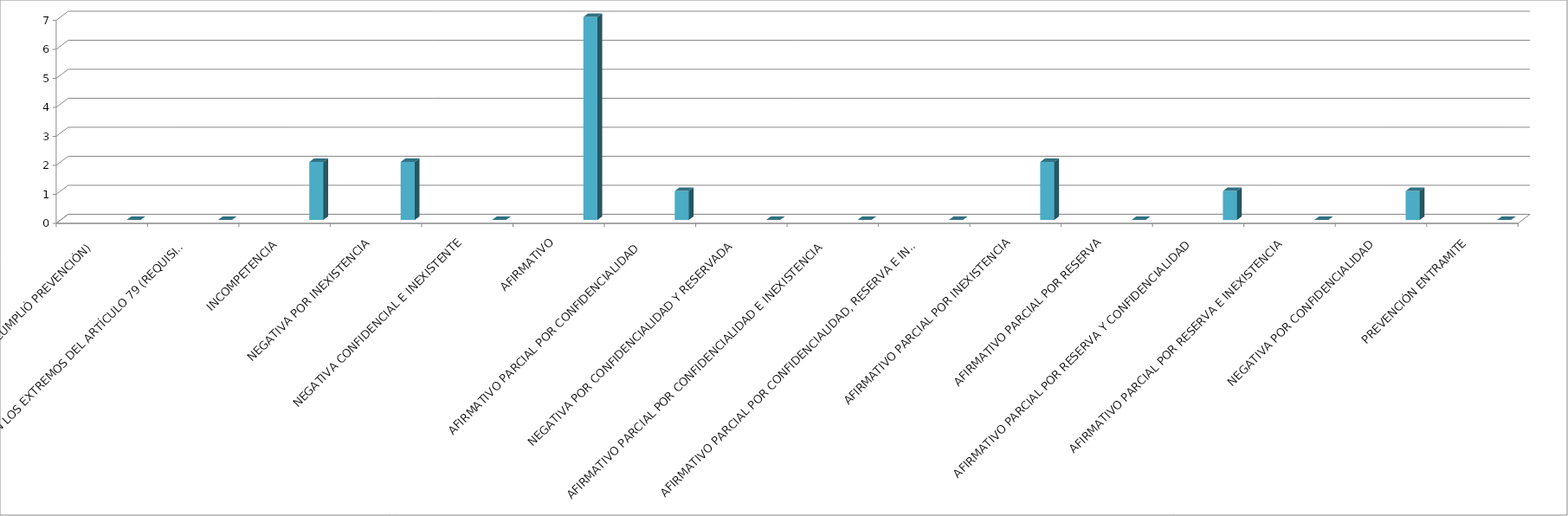
| Category | Series 0 | Series 1 | Series 2 | Series 3 | Series 4 |
|---|---|---|---|---|---|
| SE TIENE POR NO PRESENTADA ( NO CUMPLIÓ PREVENCIÓN) |  |  |  |  | 0 |
| NO CUMPLIO CON LOS EXTREMOS DEL ARTÍCULO 79 (REQUISITOS) |  |  |  |  | 0 |
| INCOMPETENCIA  |  |  |  |  | 2 |
| NEGATIVA POR INEXISTENCIA |  |  |  |  | 2 |
| NEGATIVA CONFIDENCIAL E INEXISTENTE |  |  |  |  | 0 |
| AFIRMATIVO |  |  |  |  | 7 |
| AFIRMATIVO PARCIAL POR CONFIDENCIALIDAD  |  |  |  |  | 1 |
| NEGATIVA POR CONFIDENCIALIDAD Y RESERVADA |  |  |  |  | 0 |
| AFIRMATIVO PARCIAL POR CONFIDENCIALIDAD E INEXISTENCIA |  |  |  |  | 0 |
| AFIRMATIVO PARCIAL POR CONFIDENCIALIDAD, RESERVA E INEXISTENCIA |  |  |  |  | 0 |
| AFIRMATIVO PARCIAL POR INEXISTENCIA |  |  |  |  | 2 |
| AFIRMATIVO PARCIAL POR RESERVA |  |  |  |  | 0 |
| AFIRMATIVO PARCIAL POR RESERVA Y CONFIDENCIALIDAD |  |  |  |  | 1 |
| AFIRMATIVO PARCIAL POR RESERVA E INEXISTENCIA |  |  |  |  | 0 |
| NEGATIVA POR CONFIDENCIALIDAD |  |  |  |  | 1 |
| PREVENCIÓN ENTRAMITE |  |  |  |  | 0 |